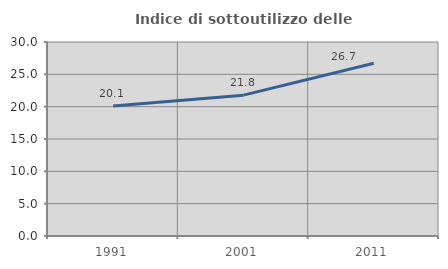
| Category | Indice di sottoutilizzo delle abitazioni  |
|---|---|
| 1991.0 | 20.09 |
| 2001.0 | 21.782 |
| 2011.0 | 26.712 |